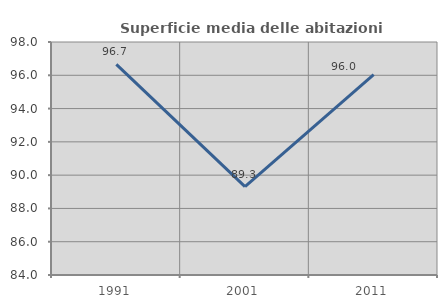
| Category | Superficie media delle abitazioni occupate |
|---|---|
| 1991.0 | 96.652 |
| 2001.0 | 89.307 |
| 2011.0 | 96.038 |